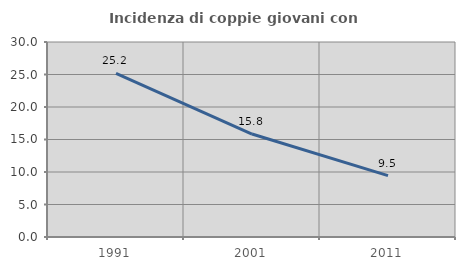
| Category | Incidenza di coppie giovani con figli |
|---|---|
| 1991.0 | 25.164 |
| 2001.0 | 15.838 |
| 2011.0 | 9.451 |